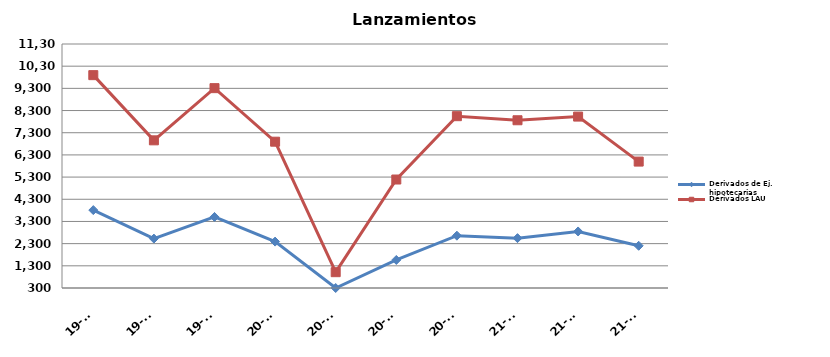
| Category | Derivados de Ej. hipotecarias | Derivados LAU |
|---|---|---|
| 19-T2 | 3812 | 9896 |
| 19-T3 | 2527 | 6957 |
| 19-T4 | 3503 | 9310 |
| 20-T1 | 2392 | 6896 |
| 20-T2 | 300 | 1013 |
| 20-T3 | 1564 | 5190 |
| 20-T4 | 2659 | 8046 |
| 21-T1 | 2548 | 7862 |
| 21-T2 | 2849 | 8028 |
| 21-T3 | 2203 | 5999 |